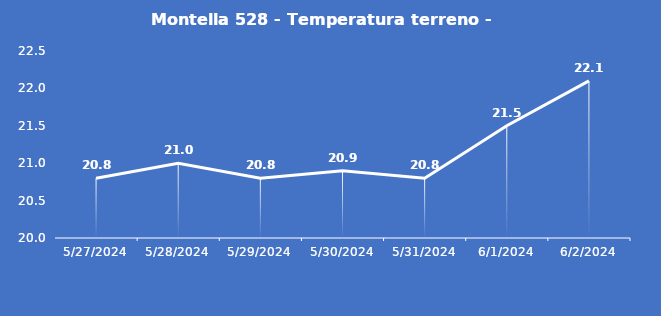
| Category | Montella 528 - Temperatura terreno - Grezzo (°C) |
|---|---|
| 5/27/24 | 20.8 |
| 5/28/24 | 21 |
| 5/29/24 | 20.8 |
| 5/30/24 | 20.9 |
| 5/31/24 | 20.8 |
| 6/1/24 | 21.5 |
| 6/2/24 | 22.1 |